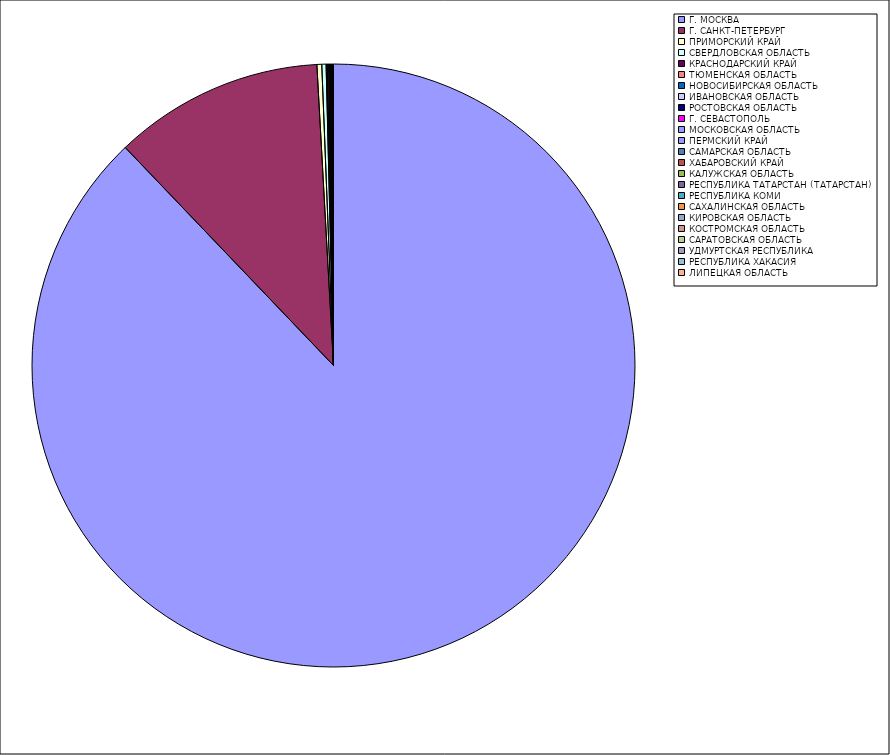
| Category | Оборот |
|---|---|
| Г. МОСКВА | 87.834 |
| Г. САНКТ-ПЕТЕРБУРГ | 11.255 |
| ПРИМОРСКИЙ КРАЙ | 0.259 |
| СВЕРДЛОВСКАЯ ОБЛАСТЬ | 0.229 |
| КРАСНОДАРСКИЙ КРАЙ | 0.068 |
| ТЮМЕНСКАЯ ОБЛАСТЬ | 0.064 |
| НОВОСИБИРСКАЯ ОБЛАСТЬ | 0.041 |
| ИВАНОВСКАЯ ОБЛАСТЬ | 0.032 |
| РОСТОВСКАЯ ОБЛАСТЬ | 0.03 |
| Г. СЕВАСТОПОЛЬ | 0.022 |
| МОСКОВСКАЯ ОБЛАСТЬ | 0.019 |
| ПЕРМСКИЙ КРАЙ | 0.018 |
| САМАРСКАЯ ОБЛАСТЬ | 0.017 |
| ХАБАРОВСКИЙ КРАЙ | 0.011 |
| КАЛУЖСКАЯ ОБЛАСТЬ | 0.011 |
| РЕСПУБЛИКА ТАТАРСТАН (ТАТАРСТАН) | 0.009 |
| РЕСПУБЛИКА КОМИ | 0.007 |
| САХАЛИНСКАЯ ОБЛАСТЬ | 0.007 |
| КИРОВСКАЯ ОБЛАСТЬ | 0.007 |
| КОСТРОМСКАЯ ОБЛАСТЬ | 0.006 |
| САРАТОВСКАЯ ОБЛАСТЬ | 0.006 |
| УДМУРТСКАЯ РЕСПУБЛИКА | 0.005 |
| РЕСПУБЛИКА ХАКАСИЯ | 0.005 |
| ЛИПЕЦКАЯ ОБЛАСТЬ | 0.004 |